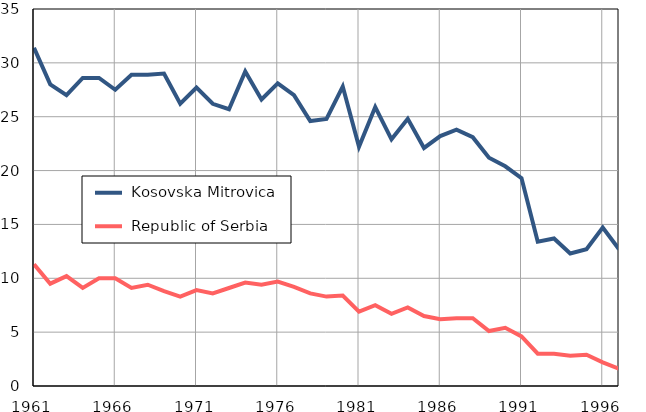
| Category |  Kosovska Mitrovica |  Republic of Serbia |
|---|---|---|
| 1961.0 | 31.4 | 11.3 |
| 1962.0 | 28 | 9.5 |
| 1963.0 | 27 | 10.2 |
| 1964.0 | 28.6 | 9.1 |
| 1965.0 | 28.6 | 10 |
| 1966.0 | 27.5 | 10 |
| 1967.0 | 28.9 | 9.1 |
| 1968.0 | 28.9 | 9.4 |
| 1969.0 | 29 | 8.8 |
| 1970.0 | 26.2 | 8.3 |
| 1971.0 | 27.7 | 8.9 |
| 1972.0 | 26.2 | 8.6 |
| 1973.0 | 25.7 | 9.1 |
| 1974.0 | 29.2 | 9.6 |
| 1975.0 | 26.6 | 9.4 |
| 1976.0 | 28.1 | 9.7 |
| 1977.0 | 27 | 9.2 |
| 1978.0 | 24.6 | 8.6 |
| 1979.0 | 24.8 | 8.3 |
| 1980.0 | 27.8 | 8.4 |
| 1981.0 | 22.2 | 6.9 |
| 1982.0 | 25.9 | 7.5 |
| 1983.0 | 22.9 | 6.7 |
| 1984.0 | 24.8 | 7.3 |
| 1985.0 | 22.1 | 6.5 |
| 1986.0 | 23.2 | 6.2 |
| 1987.0 | 23.8 | 6.3 |
| 1988.0 | 23.1 | 6.3 |
| 1989.0 | 21.2 | 5.1 |
| 1990.0 | 20.4 | 5.4 |
| 1991.0 | 19.3 | 4.6 |
| 1992.0 | 13.4 | 3 |
| 1993.0 | 13.7 | 3 |
| 1994.0 | 12.3 | 2.8 |
| 1995.0 | 12.7 | 2.9 |
| 1996.0 | 14.7 | 2.2 |
| 1997.0 | 12.7 | 1.6 |